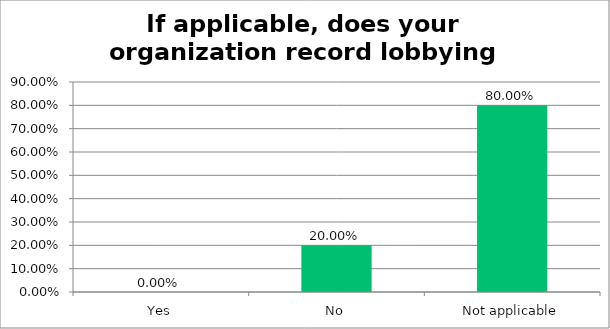
| Category | Responses |
|---|---|
| Yes | 0 |
| No | 0.2 |
| Not applicable | 0.8 |